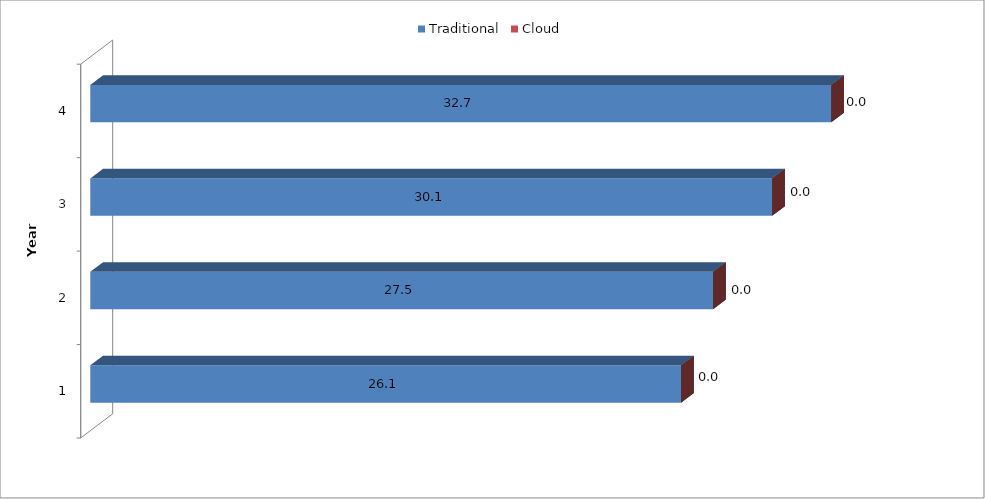
| Category | Traditional | Cloud |
|---|---|---|
| 1.0 | 26.053 | 0 |
| 2.0 | 27.464 | 0 |
| 3.0 | 30.069 | 0 |
| 4.0 | 32.674 | 0 |